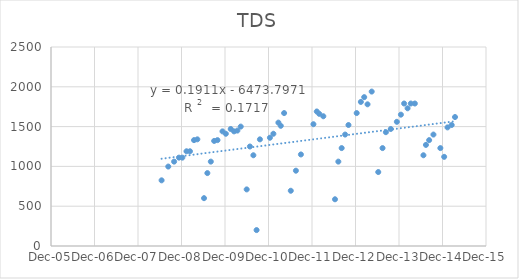
| Category | Series 0 |
|---|---|
| 39618.0 | 825 |
| 39674.0 | 998 |
| 39723.0 | 1060 |
| 39764.0 | 1110 |
| 39792.0 | 1110 |
| 39827.0 | 1190 |
| 39856.0 | 1190 |
| 39890.0 | 1330 |
| 39918.0 | 1340 |
| 39974.0 | 601 |
| 40002.0 | 916 |
| 40031.0 | 1060 |
| 40059.0 | 1320 |
| 40087.0 | 1330 |
| 40129.0 | 1440 |
| 40157.0 | 1410 |
| 40198.0 | 1470 |
| 40226.0 | 1440 |
| 40282.0 | 1500 |
| 40254.0 | 1450 |
| 40332.0 | 711 |
| 40359.0 | 1250 |
| 40388.0 | 1140 |
| 40415.0 | 200 |
| 40443.0 | 1340 |
| 40527.0 | 1360 |
| 40556.0 | 1410 |
| 40598.0 | 1550 |
| 40618.0 | 1510 |
| 40646.0 | 1670 |
| 40702.0 | 694 |
| 40745.0 | 946 |
| 40787.0 | 1150 |
| 40892.0 | 1530 |
| 40920.0 | 1690 |
| 40941.0 | 1660 |
| 40975.0 | 1630 |
| 41073.0 | 587 |
| 41101.0 | 1060 |
| 41129.0 | 1230 |
| 41158.0 | 1400 |
| 41186.0 | 1520 |
| 41255.0 | 1670 |
| 41290.0 | 1810 |
| 41318.0 | 1870 |
| 41346.0 | 1780 |
| 41381.0 | 1940 |
| 41436.0 | 929 |
| 41472.0 | 1230 |
| 41500.0 | 1430 |
| 41541.0 | 1470 |
| 41592.0 | 1560 |
| 41626.0 | 1650 |
| 41653.0 | 1790 |
| 41682.0 | 1730 |
| 41709.0 | 1790 |
| 41743.0 | 1790 |
| 41815.0 | 1140 |
| 41836.0 | 1270 |
| 41863.0 | 1330 |
| 41899.0 | 1400 |
| 41957.0 | 1230 |
| 41989.0 | 1120 |
| 42017.0 | 1490 |
| 42052.0 | 1520 |
| 42080.0 | 1620 |